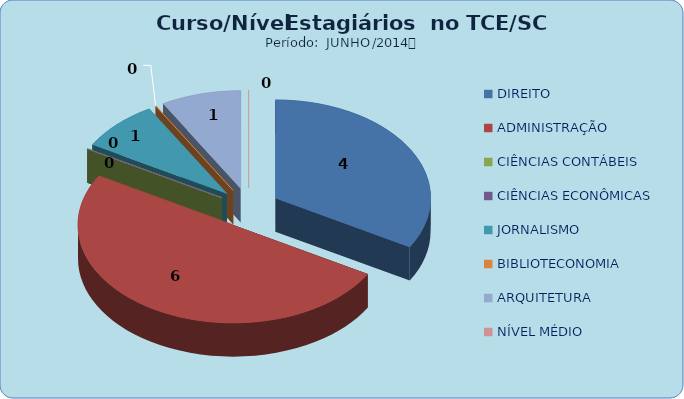
| Category | Series 0 |
|---|---|
| DIREITO | 4 |
| ADMINISTRAÇÃO | 6 |
| CIÊNCIAS CONTÁBEIS | 0 |
| CIÊNCIAS ECONÔMICAS | 0 |
| JORNALISMO | 1 |
| BIBLIOTECONOMIA | 0 |
| ARQUITETURA | 1 |
| NÍVEL MÉDIO | 0 |